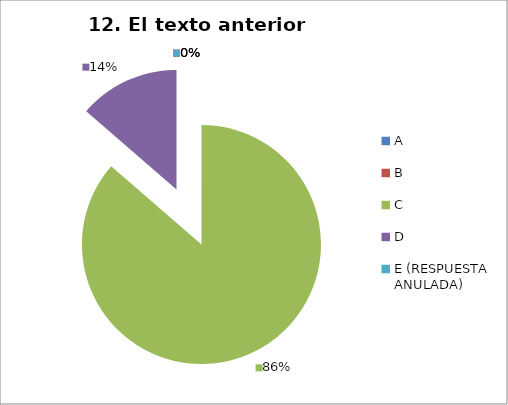
| Category | CANTIDAD DE RESPUESTAS PREGUNTA (12) | PORCENTAJE |
|---|---|---|
| A | 0 | 0 |
| B | 0 | 0 |
| C | 19 | 0.864 |
| D | 3 | 0.136 |
| E (RESPUESTA ANULADA) | 0 | 0 |